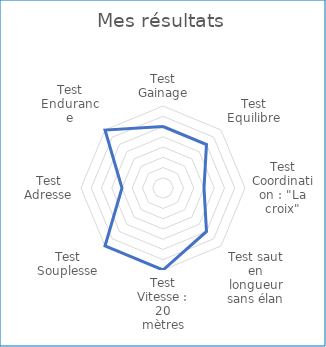
| Category | Series 0 |
|---|---|
| Test Gainage | 3 |
| Test Equilibre | 3 |
| Test Coordination : "La croix" | 2 |
| Test saut en longueur sans élan | 3 |
| Test Vitesse : 20 mètres | 4 |
| Test Souplesse | 4 |
| Test Adresse | 2 |
| Test Endurance | 4 |